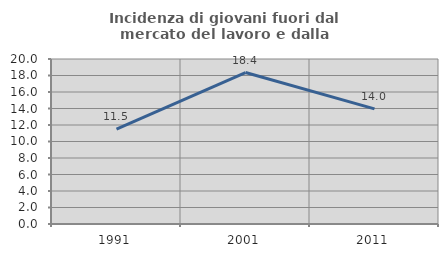
| Category | Incidenza di giovani fuori dal mercato del lavoro e dalla formazione  |
|---|---|
| 1991.0 | 11.512 |
| 2001.0 | 18.362 |
| 2011.0 | 13.953 |